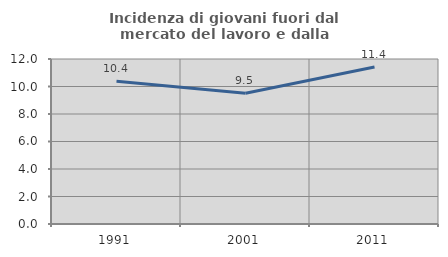
| Category | Incidenza di giovani fuori dal mercato del lavoro e dalla formazione  |
|---|---|
| 1991.0 | 10.377 |
| 2001.0 | 9.502 |
| 2011.0 | 11.413 |